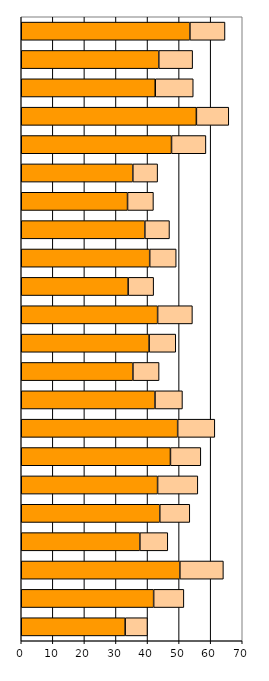
| Category | Series 0 | Series 1 |
|---|---|---|
| 0 | 32.913 | 7.061 |
| 1 | 41.935 | 9.573 |
| 2 | 50.234 | 13.792 |
| 3 | 37.57 | 8.847 |
| 4 | 43.875 | 9.508 |
| 5 | 43.183 | 12.742 |
| 6 | 47.258 | 9.622 |
| 7 | 49.541 | 11.768 |
| 8 | 42.359 | 8.697 |
| 9 | 35.362 | 8.295 |
| 10 | 40.501 | 8.444 |
| 11 | 43.191 | 11.021 |
| 12 | 33.852 | 8.086 |
| 13 | 40.684 | 8.393 |
| 14 | 39.144 | 7.804 |
| 15 | 33.665 | 8.202 |
| 16 | 35.339 | 7.853 |
| 17 | 47.591 | 10.9 |
| 18 | 55.472 | 10.262 |
| 19 | 42.443 | 12.036 |
| 20 | 43.56 | 10.726 |
| 21 | 53.417 | 11.115 |